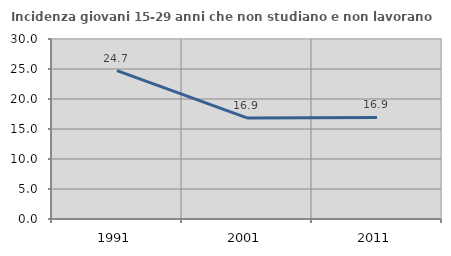
| Category | Incidenza giovani 15-29 anni che non studiano e non lavorano  |
|---|---|
| 1991.0 | 24.731 |
| 2001.0 | 16.854 |
| 2011.0 | 16.923 |